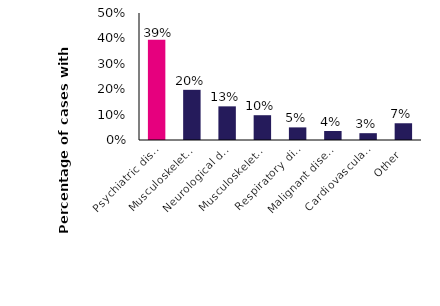
| Category | Series 0 |
|---|---|
| Psychiatric disorders | 0.395 |
| Musculoskeletal disease (general) | 0.198 |
| Neurological disease | 0.132 |
| Musculoskeletal disease (regional) | 0.098 |
| Respiratory disease | 0.05 |
| Malignant disease | 0.035 |
| Cardiovascular disease | 0.027 |
| Other | 0.066 |